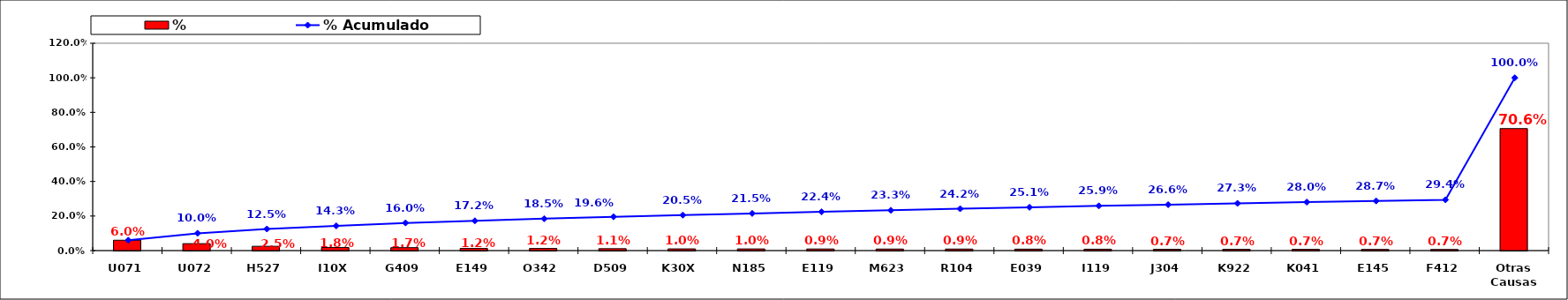
| Category | % |
|---|---|
| U071 | 0.06 |
| U072 | 0.04 |
| H527 | 0.025 |
| I10X | 0.018 |
| G409 | 0.017 |
| E149 | 0.012 |
| O342 | 0.012 |
| D509 | 0.011 |
| K30X | 0.01 |
| N185 | 0.01 |
| E119 | 0.009 |
| M623 | 0.009 |
| R104 | 0.009 |
| E039 | 0.008 |
| I119 | 0.008 |
| J304 | 0.007 |
| K922 | 0.007 |
| K041 | 0.007 |
| E145 | 0.007 |
| F412 | 0.007 |
| Otras Causas | 0.706 |